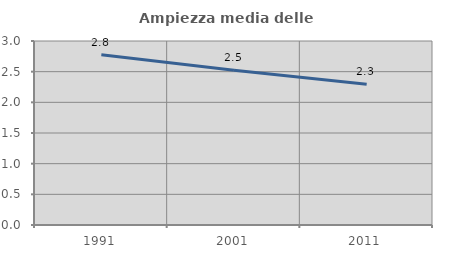
| Category | Ampiezza media delle famiglie |
|---|---|
| 1991.0 | 2.775 |
| 2001.0 | 2.524 |
| 2011.0 | 2.296 |